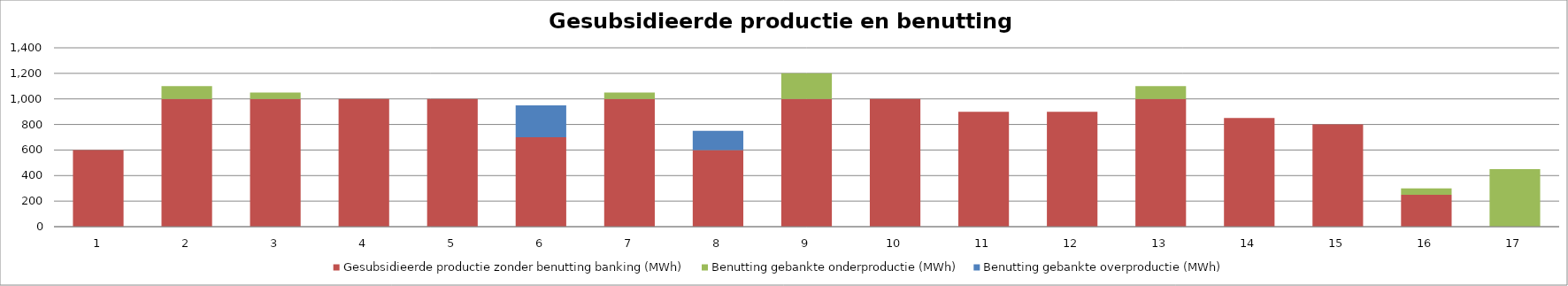
| Category | Gesubsidieerde productie zonder benutting banking (MWh) | Benutting gebankte onderproductie (MWh) | Benutting gebankte overproductie (MWh) |
|---|---|---|---|
| 0 | 600 | 0 | 0 |
| 1 | 1000 | 100 | 0 |
| 2 | 1000 | 50 | 0 |
| 3 | 1000 | 0 | 0 |
| 4 | 1000 | 0 | 0 |
| 5 | 700 | 0 | 250 |
| 6 | 1000 | 50 | 0 |
| 7 | 600 | 0 | 150 |
| 8 | 1000 | 200 | 0 |
| 9 | 1000 | 0 | 0 |
| 10 | 900 | 0 | 0 |
| 11 | 900 | 0 | 0 |
| 12 | 1000 | 100 | 0 |
| 13 | 850 | 0 | 0 |
| 14 | 800 | 0 | 0 |
| 15 | 250 | 50 | 0 |
| 16 | 0 | 450 | 0 |